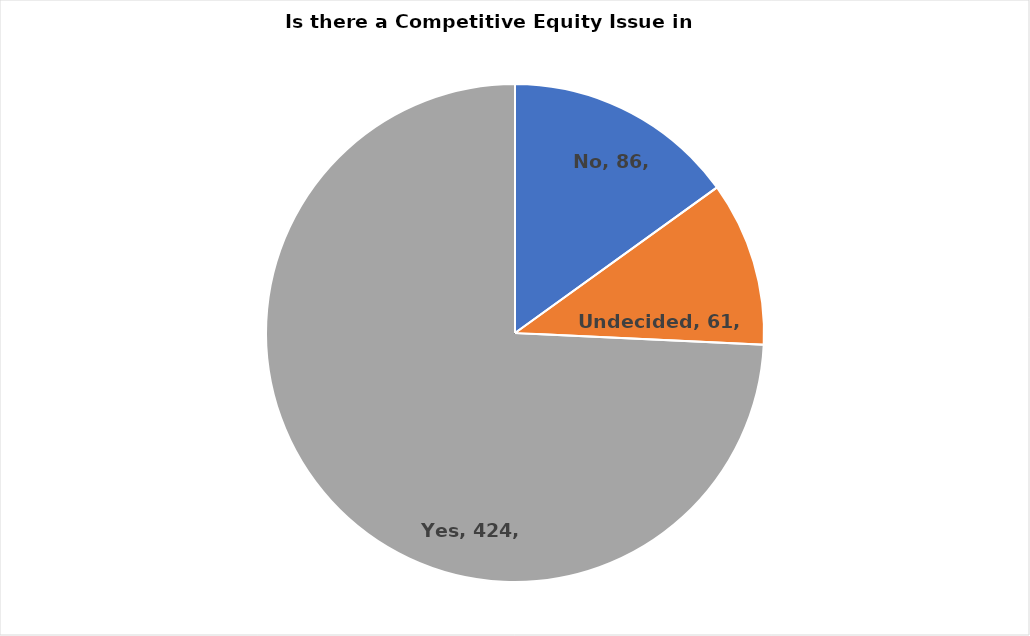
| Category | Series 0 |
|---|---|
| No | 86 |
| Undecided | 61 |
| Yes | 424 |